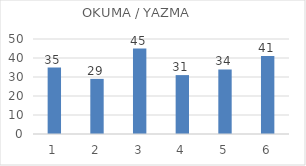
| Category | Series 0 |
|---|---|
| 0 | 35 |
| 1 | 29 |
| 2 | 45 |
| 3 | 31 |
| 4 | 34 |
| 5 | 41 |